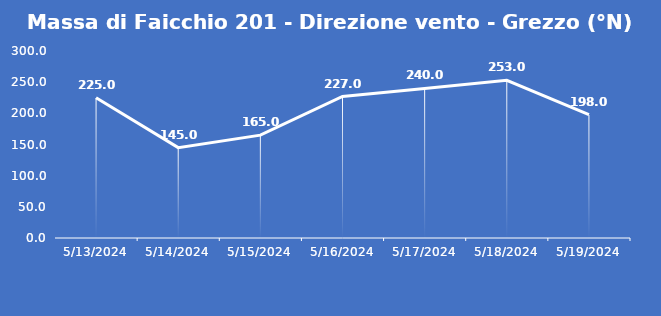
| Category | Massa di Faicchio 201 - Direzione vento - Grezzo (°N) |
|---|---|
| 5/13/24 | 225 |
| 5/14/24 | 145 |
| 5/15/24 | 165 |
| 5/16/24 | 227 |
| 5/17/24 | 240 |
| 5/18/24 | 253 |
| 5/19/24 | 198 |